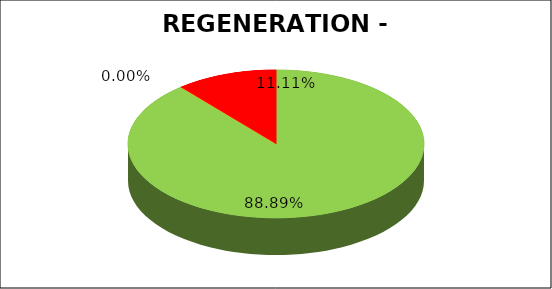
| Category | Series 0 |
|---|---|
| Green | 0.889 |
| Amber | 0 |
| Red | 0.111 |